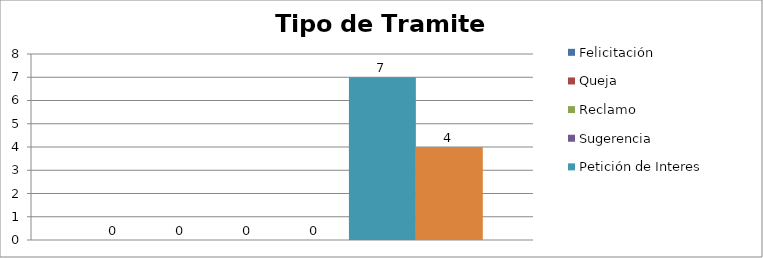
| Category | Felicitación | Queja | Reclamo | Sugerencia | Petición de Interes General | Petición de Interes Particular |
|---|---|---|---|---|---|---|
| 0 | 0 | 0 | 0 | 0 | 7 | 4 |